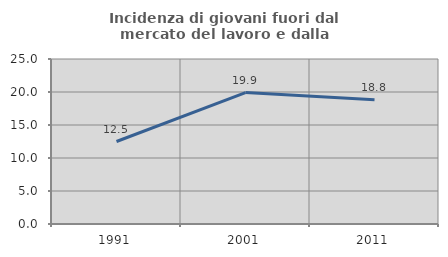
| Category | Incidenza di giovani fuori dal mercato del lavoro e dalla formazione  |
|---|---|
| 1991.0 | 12.5 |
| 2001.0 | 19.916 |
| 2011.0 | 18.843 |